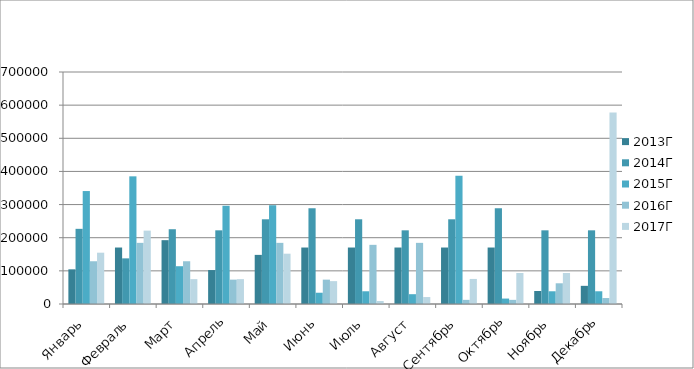
| Category | 2013Г | 2014Г | 2015Г | 2016Г | 2017Г |
|---|---|---|---|---|---|
| Январь  | 104600 | 226800 | 340800 | 129000 | 154800 |
| Февраль  | 170400 | 137700 | 385200 | 184500 | 221400 |
| Март | 192600 | 225600 | 114000 | 129000 | 75000 |
| Апрель | 102400 | 222300 | 296400 | 73500 | 75000 |
| Май | 148200 | 255600 | 298000 | 184500 | 151800 |
| Июнь | 170400 | 288900 | 34000 | 73500 | 69000 |
| Июль | 170400 | 255600 | 38400 | 178500 | 9000 |
| Август | 170400 | 222300 | 29600 | 184500 | 21000 |
| Сентябрь | 170400 | 255600 | 386800 | 12500 | 75600 |
| Октябрь | 170400 | 288900 | 16400 | 12500 | 93600 |
| Ноябрь | 39200 | 222300 | 38400 | 62500 | 93600 |
| Декабрь | 54800 | 222300 | 38400 | 18000 | 577800 |